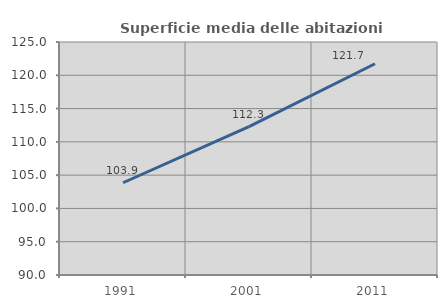
| Category | Superficie media delle abitazioni occupate |
|---|---|
| 1991.0 | 103.858 |
| 2001.0 | 112.3 |
| 2011.0 | 121.733 |